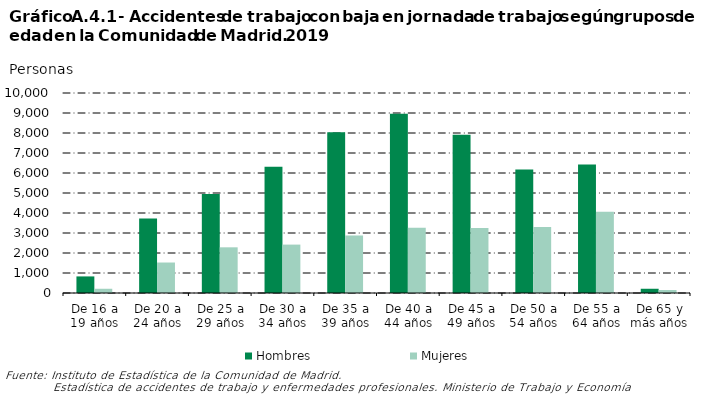
| Category | Hombres | Mujeres |
|---|---|---|
| 0 | 829 | 212 |
| 1 | 3721 | 1524 |
| 2 | 4948 | 2284 |
| 3 | 6317 | 2420 |
| 4 | 8033 | 2879 |
| 5 | 8957 | 3257 |
| 6 | 7914 | 3249 |
| 7 | 6171 | 3294 |
| 8 | 6431 | 4057 |
| 9 | 212 | 149 |